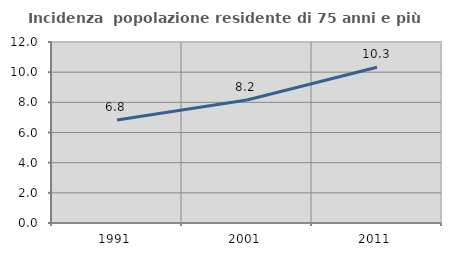
| Category | Incidenza  popolazione residente di 75 anni e più |
|---|---|
| 1991.0 | 6.826 |
| 2001.0 | 8.155 |
| 2011.0 | 10.328 |